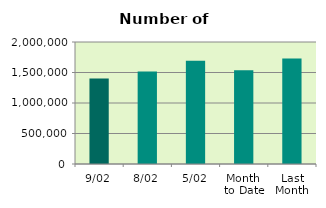
| Category | Series 0 |
|---|---|
| 9/02 | 1400296 |
| 8/02 | 1517386 |
| 5/02 | 1694252 |
| Month 
to Date | 1535287.714 |
| Last
Month | 1728874.4 |